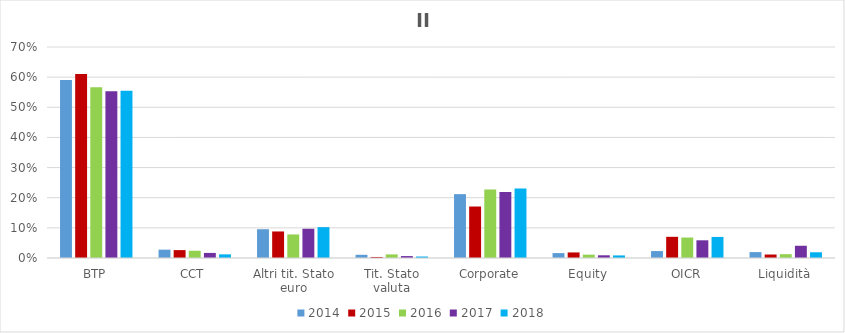
| Category | 2014 | 2015 | 2016 | 2017 | 2018 |
|---|---|---|---|---|---|
| BTP | 0.59 | 0.61 | 0.566 | 0.553 | 0.555 |
| CCT | 0.028 | 0.026 | 0.024 | 0.017 | 0.012 |
| Altri tit. Stato euro | 0.095 | 0.088 | 0.078 | 0.097 | 0.102 |
| Tit. Stato valuta | 0.011 | 0.003 | 0.012 | 0.006 | 0.005 |
| Corporate | 0.212 | 0.171 | 0.227 | 0.219 | 0.231 |
| Equity | 0.016 | 0.018 | 0.011 | 0.009 | 0.009 |
| OICR | 0.023 | 0.07 | 0.068 | 0.059 | 0.07 |
| Liquidità | 0.02 | 0.012 | 0.013 | 0.041 | 0.019 |